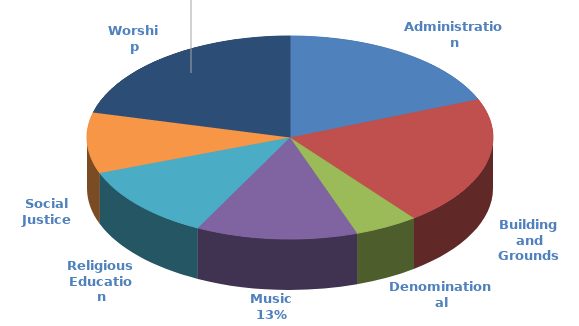
| Category | Total |
|---|---|
| Administration | 157565.952 |
| Building and Grounds | 173317.6 |
| Denominational | 42369 |
| Music | 107491.851 |
| Religious Education | 98674.525 |
| Social Justice | 80814.712 |
| Worship | 175857.143 |